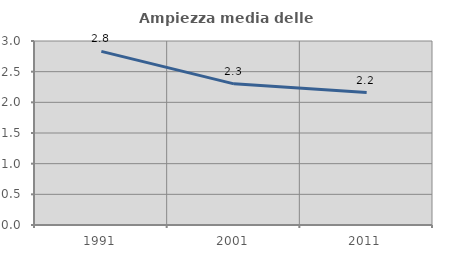
| Category | Ampiezza media delle famiglie |
|---|---|
| 1991.0 | 2.831 |
| 2001.0 | 2.301 |
| 2011.0 | 2.16 |